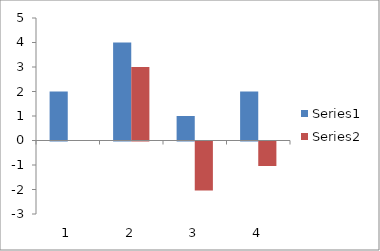
| Category | Series 0 | Series 1 |
|---|---|---|
| 0 | 2 | 0 |
| 1 | 4 | 3 |
| 2 | 1 | -2 |
| 3 | 2 | -1 |